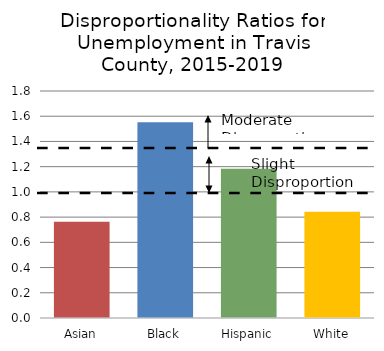
| Category | Series 0 |
|---|---|
| Asian | 0.763 |
| Black | 1.553 |
| Hispanic | 1.184 |
| White | 0.842 |